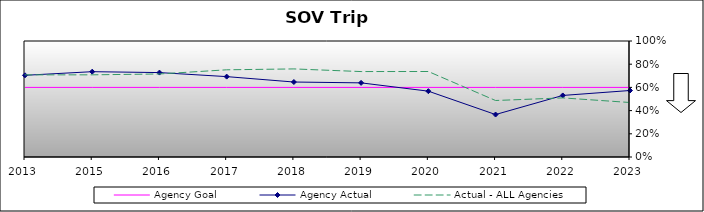
| Category | Agency Goal | Agency Actual | Actual - ALL Agencies |
|---|---|---|---|
| 2013.0 | 0.6 | 0.704 | 0.708 |
| 2015.0 | 0.6 | 0.736 | 0.708 |
| 2016.0 | 0.6 | 0.728 | 0.716 |
| 2017.0 | 0.6 | 0.693 | 0.752 |
| 2018.0 | 0.6 | 0.646 | 0.759 |
| 2019.0 | 0.6 | 0.639 | 0.736 |
| 2020.0 | 0.6 | 0.568 | 0.737 |
| 2021.0 | 0.6 | 0.366 | 0.487 |
| 2022.0 | 0.6 | 0.531 | 0.509 |
| 2023.0 | 0.6 | 0.573 | 0.47 |